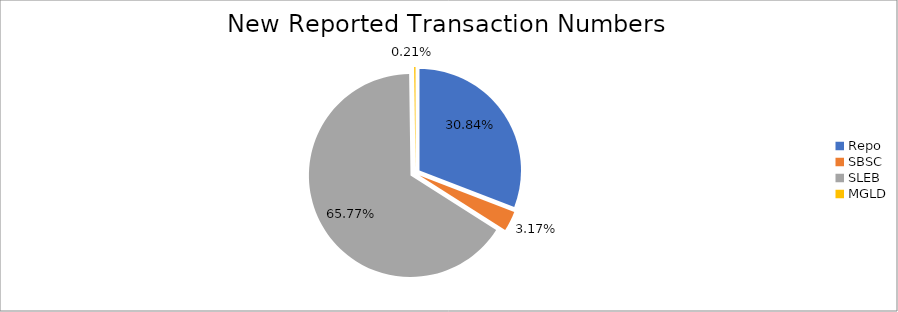
| Category | Series 0 |
|---|---|
| Repo | 413512 |
| SBSC | 42517 |
| SLEB | 881804 |
| MGLD | 2871 |